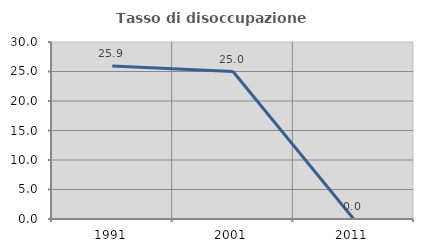
| Category | Tasso di disoccupazione giovanile  |
|---|---|
| 1991.0 | 25.926 |
| 2001.0 | 25 |
| 2011.0 | 0 |